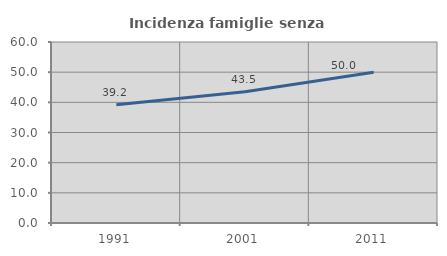
| Category | Incidenza famiglie senza nuclei |
|---|---|
| 1991.0 | 39.172 |
| 2001.0 | 43.509 |
| 2011.0 | 49.961 |